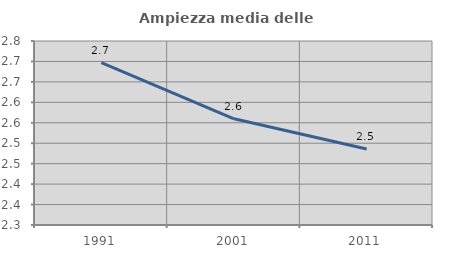
| Category | Ampiezza media delle famiglie |
|---|---|
| 1991.0 | 2.697 |
| 2001.0 | 2.56 |
| 2011.0 | 2.486 |